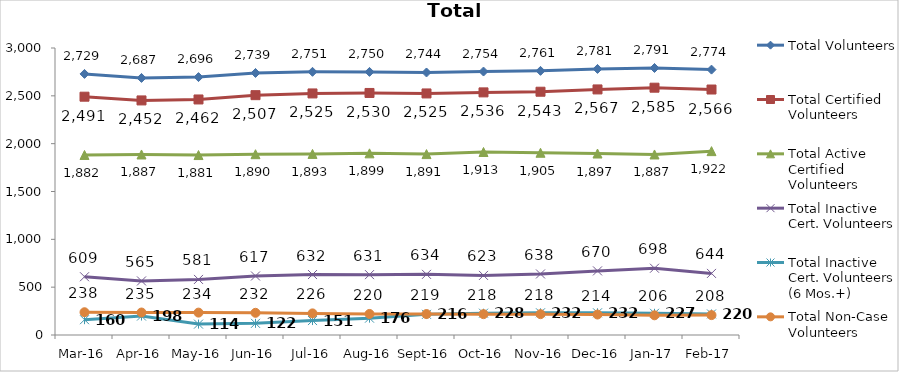
| Category | Total Volunteers | Total Certified Volunteers | Total Active Certified Volunteers | Total Inactive Cert. Volunteers | Total Inactive Cert. Volunteers (6 Mos.+) | Total Non-Case Volunteers |
|---|---|---|---|---|---|---|
| Mar-16 | 2729 | 2491 | 1882 | 609 | 160 | 238 |
| Apr-16 | 2687 | 2452 | 1887 | 565 | 198 | 235 |
| May-16 | 2696 | 2462 | 1881 | 581 | 114 | 234 |
| Jun-16 | 2739 | 2507 | 1890 | 617 | 122 | 232 |
| Jul-16 | 2751 | 2525 | 1893 | 632 | 151 | 226 |
| Aug-16 | 2750 | 2530 | 1899 | 631 | 176 | 220 |
| Sep-16 | 2744 | 2525 | 1891 | 634 | 216 | 219 |
| Oct-16 | 2754 | 2536 | 1913 | 623 | 228 | 218 |
| Nov-16 | 2761 | 2543 | 1905 | 638 | 232 | 218 |
| Dec-16 | 2781 | 2567 | 1897 | 670 | 232 | 214 |
| Jan-17 | 2791 | 2585 | 1887 | 698 | 227 | 206 |
| Feb-17 | 2774 | 2566 | 1922 | 644 | 220 | 208 |